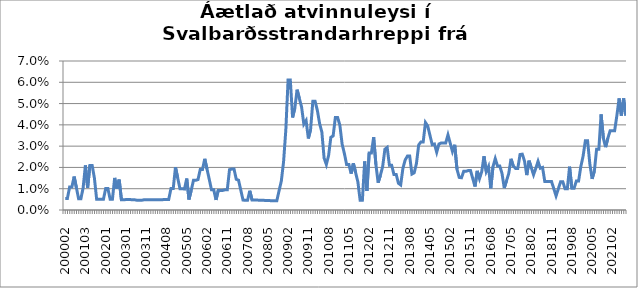
| Category | Series 0 |
|---|---|
| 200002 | 0.005 |
| 200003 | 0.005 |
| 200005 | 0.011 |
| 200006 | 0.011 |
| 200007 | 0.016 |
| 200008 | 0.01 |
| 200012 | 0.005 |
| 200101 | 0.005 |
| 200102 | 0.01 |
| 200103 | 0.021 |
| 200104 | 0.01 |
| 200105 | 0.021 |
| 200106 | 0.021 |
| 200107 | 0.015 |
| 200108 | 0.005 |
| 200109 | 0.005 |
| 200111 | 0.005 |
| 200112 | 0.005 |
| 200201 | 0.01 |
| 200202 | 0.01 |
| 200203 | 0.005 |
| 200204 | 0.005 |
| 200205 | 0.015 |
| 200206 | 0.01 |
| 200207 | 0.014 |
| 200209 | 0.005 |
| 200210 | 0.005 |
| 200301 | 0.005 |
| 200302 | 0.005 |
| 200303 | 0.005 |
| 200304 | 0.005 |
| 200305 | 0.005 |
| 200307 | 0.005 |
| 200308 | 0.005 |
| 200309 | 0.005 |
| 200310 | 0.005 |
| 200311 | 0.005 |
| 200312 | 0.005 |
| 200401 | 0.005 |
| 200402 | 0.005 |
| 200403 | 0.005 |
| 200404 | 0.005 |
| 200405 | 0.005 |
| 200406 | 0.005 |
| 200407 | 0.005 |
| 200408 | 0.005 |
| 200409 | 0.005 |
| 200410 | 0.01 |
| 200411 | 0.01 |
| 200412 | 0.02 |
| 200501 | 0.015 |
| 200502 | 0.01 |
| 200503 | 0.01 |
| 200504 | 0.01 |
| 200505 | 0.015 |
| 200506 | 0.005 |
| 200507 | 0.009 |
| 200508 | 0.014 |
| 200509 | 0.014 |
| 200510 | 0.014 |
| 200511 | 0.019 |
| 200512 | 0.019 |
| 200601 | 0.024 |
| 200602 | 0.019 |
| 200603 | 0.014 |
| 200604 | 0.009 |
| 200605 | 0.009 |
| 200606 | 0.005 |
| 200607 | 0.009 |
| 200608 | 0.009 |
| 200609 | 0.009 |
| 200610 | 0.009 |
| 200611 | 0.009 |
| 200612 | 0.019 |
| 200701 | 0.019 |
| 200702 | 0.019 |
| 200703 | 0.014 |
| 200704 | 0.014 |
| 200705 | 0.009 |
| 200706 | 0.005 |
| 200707 | 0.005 |
| 200708 | 0.005 |
| 200709 | 0.009 |
| 200710 | 0.005 |
| 200711 | 0.005 |
| 200712 | 0.005 |
| 200801 | 0.005 |
| 200802 | 0.005 |
| 200803 | 0.005 |
| 200804 | 0.004 |
| 200805 | 0.004 |
| 200806 | 0.004 |
| 200807 | 0.004 |
| 200808 | 0.004 |
| 200809 | 0.004 |
| 200810 | 0.009 |
| 200811 | 0.014 |
| 200812 | 0.023 |
| 200901 | 0.038 |
| 200902 | 0.061 |
| 200903 | 0.061 |
| 200904 | 0.043 |
| 200905 | 0.048 |
| 200906 | 0.057 |
| 200907 | 0.052 |
| 200908 | 0.048 |
| 200909 | 0.04 |
| 200910 | 0.042 |
| 200911 | 0.034 |
| 200912 | 0.038 |
| 201001 | 0.051 |
| 201002 | 0.051 |
| 201003 | 0.047 |
| 201004 | 0.041 |
| 201005 | 0.037 |
| 201006 | 0.024 |
| 201007 | 0.021 |
| 201008 | 0.026 |
| 201009 | 0.034 |
| 201010 | 0.035 |
| 201011 | 0.043 |
| 201012 | 0.043 |
| 201101 | 0.04 |
| 201102 | 0.031 |
| 201103 | 0.027 |
| 201104 | 0.021 |
| 201105 | 0.021 |
| 201106 | 0.017 |
| 201107 | 0.022 |
| 201108 | 0.018 |
| 201109 | 0.013 |
| 201110 | 0.005 |
| 201111 | 0.005 |
| 201112 | 0.023 |
| 201201 | 0.009 |
| 201202 | 0.027 |
| 201203 | 0.027 |
| 201204 | 0.034 |
| 201205 | 0.021 |
| 201206 | 0.013 |
| 201207 | 0.016 |
| 201208 | 0.02 |
| 201209 | 0.029 |
| 201210 | 0.029 |
| 201211 | 0.021 |
| 201212 | 0.021 |
| 201301 | 0.017 |
| 201302 | 0.017 |
| 201303 | 0.013 |
| 201304 | 0.012 |
| 201305 | 0.02 |
| 201306 | 0.024 |
| 201307 | 0.025 |
| 201308 | 0.025 |
| 201309 | 0.017 |
| 201310 | 0.017 |
| 201311 | 0.022 |
| 201312 | 0.031 |
| 201401 | 0.032 |
| 201402 | 0.032 |
| 201403 | 0.041 |
| 201404 | 0.039 |
| 201405 | 0.035 |
| 201406 | 0.031 |
| 201407 | 0.031 |
| 201408 | 0.027 |
| 201409 | 0.031 |
| 201410 | 0.031 |
| 201411 | 0.031 |
| 201412 | 0.031 |
| 201501 | 0.035 |
| 201502 | 0.031 |
| 201503 | 0.027 |
| 201504 | 0.031 |
| 201505 | 0.019 |
| 201506 | 0.015 |
| 201507 | 0.015 |
| 201508 | 0.018 |
| 201509 | 0.018 |
| 201510 | 0.019 |
| 201511 | 0.019 |
| 201512 | 0.015 |
| 201601 | 0.011 |
| 201602 | 0.018 |
| 201603 | 0.015 |
| 201604 | 0.018 |
| 201605 | 0.025 |
| 201606 | 0.018 |
| 201607 | 0.02 |
| 201608 | 0.01 |
| 201609 | 0.02 |
| 201610 | 0.024 |
| 201611 | 0.021 |
| 201612 | 0.021 |
| 201701 | 0.017 |
| 201702 | 0.01 |
| 201703 | 0.014 |
| 201704 | 0.017 |
| 201705 | 0.024 |
| 201706 | 0.021 |
| 201707 | 0.02 |
| 201708 | 0.02 |
| 201709 | 0.026 |
| 201710 | 0.026 |
| 201711 | 0.023 |
| 201712 | 0.016 |
| 201801 | 0.023 |
| 201802 | 0.02 |
| 201803 | 0.017 |
| 201804 | 0.02 |
| 201805 | 0.023 |
| 201806 | 0.02 |
| 201807 | 0.02 |
| 201808 | 0.013 |
| 201809 | 0.013 |
| 201810 | 0.013 |
| 201811 | 0.013 |
| 201812 | 0.01 |
| 201901 | 0.007 |
| 201902 | 0.01 |
| 201903 | 0.013 |
| 201904 | 0.013 |
| 201905 | 0.01 |
| 201906 | 0.01 |
| 201907 | 0.02 |
| 201908 | 0.01 |
| 201909 | 0.01 |
| 201910 | 0.014 |
| 201911 | 0.014 |
| 201912 | 0.02 |
| 202001 | 0.025 |
| 202002 | 0.032 |
| 202003 | 0.032 |
| 202004 | 0.022 |
| 202005 | 0.015 |
| 202006 | 0.018 |
| 202007 | 0.029 |
| 202008 | 0.029 |
| 202009 | 0.045 |
| 202010 | 0.034 |
| 202011 | 0.03 |
| 202012 | 0.034 |
| 202101 | 0.037 |
| 202102 | 0.037 |
| 202103 | 0.037 |
| 202104 | 0.044 |
| 202105 | 0.052 |
| 202106 | 0.044 |
| 202107 | 0.052 |
| 202108 | 0.044 |